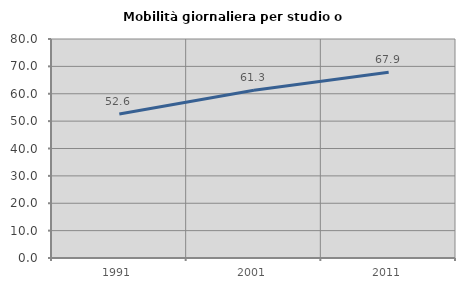
| Category | Mobilità giornaliera per studio o lavoro |
|---|---|
| 1991.0 | 52.601 |
| 2001.0 | 61.303 |
| 2011.0 | 67.866 |